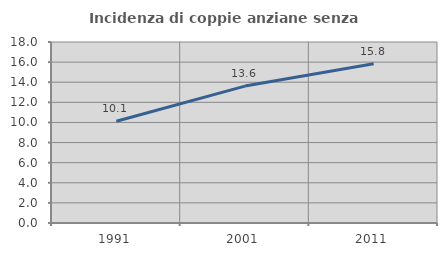
| Category | Incidenza di coppie anziane senza figli  |
|---|---|
| 1991.0 | 10.121 |
| 2001.0 | 13.616 |
| 2011.0 | 15.832 |